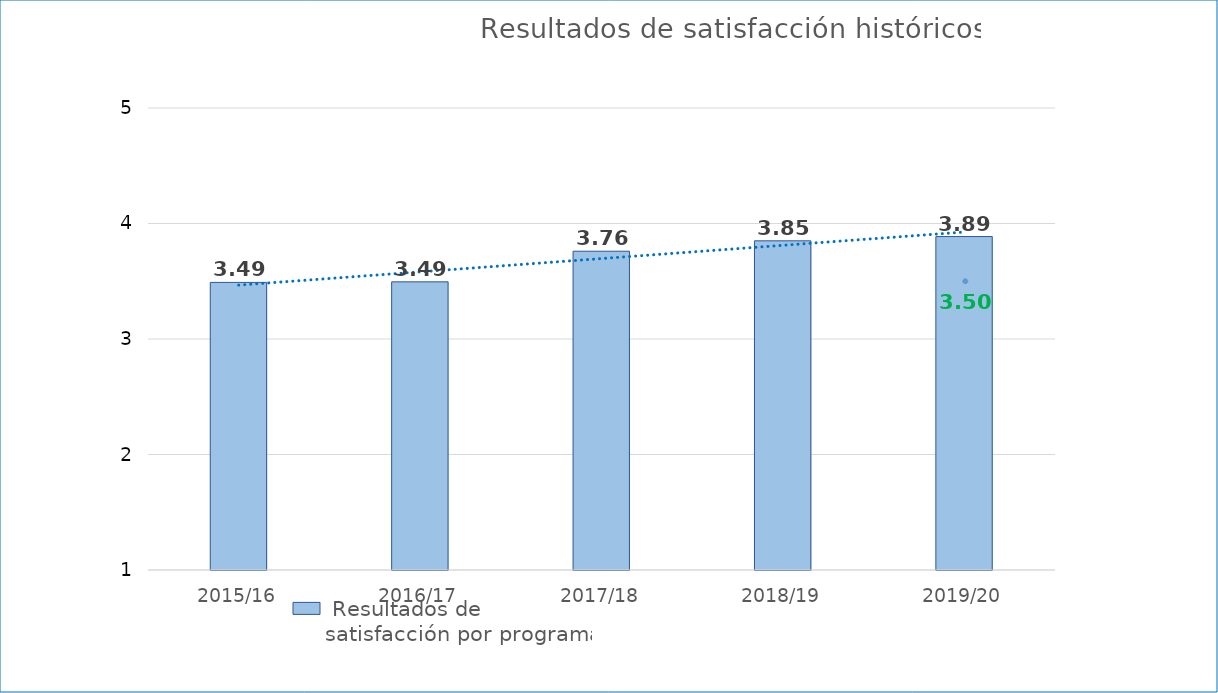
| Category |  Resultados de satisfacción por programa |
|---|---|
| 2015/16 | 3.49 |
| 2016/17 | 3.495 |
| 2017/18 | 3.76 |
| 2018/19 | 3.85 |
| 2019/20 | 3.887 |